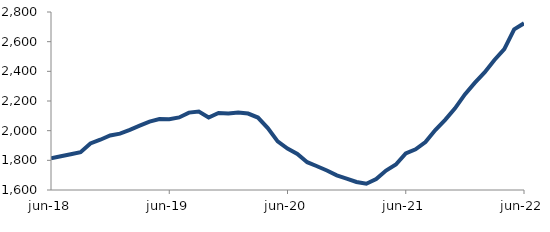
| Category | Series 0 |
|---|---|
| 2018-06-01 | 1813.666 |
| 2018-07-01 | 1827.546 |
| 2018-08-01 | 1840.869 |
| 2018-09-01 | 1854.761 |
| 2018-10-01 | 1913.466 |
| 2018-11-01 | 1938.846 |
| 2018-12-01 | 1967.481 |
| 2019-01-01 | 1980.122 |
| 2019-02-01 | 2005.664 |
| 2019-03-01 | 2033.637 |
| 2019-04-01 | 2060.76 |
| 2019-05-01 | 2078.07 |
| 2019-06-01 | 2076.377 |
| 2019-07-01 | 2089.152 |
| 2019-08-01 | 2121.901 |
| 2019-09-01 | 2128.491 |
| 2019-10-01 | 2088.553 |
| 2019-11-01 | 2119.211 |
| 2019-12-01 | 2116.27 |
| 2020-01-01 | 2123.179 |
| 2020-02-01 | 2115.217 |
| 2020-03-01 | 2088.6 |
| 2020-04-01 | 2017.241 |
| 2020-05-01 | 1928.116 |
| 2020-06-01 | 1878.979 |
| 2020-07-01 | 1843.29 |
| 2020-08-01 | 1787.543 |
| 2020-09-01 | 1760.281 |
| 2020-10-01 | 1731.197 |
| 2020-11-01 | 1698.835 |
| 2020-12-01 | 1677.184 |
| 2021-01-01 | 1654.072 |
| 2021-02-01 | 1641.869 |
| 2021-03-01 | 1673.821 |
| 2021-04-01 | 1730.759 |
| 2021-05-01 | 1771.425 |
| 2021-06-01 | 1846.573 |
| 2021-07-01 | 1874.111 |
| 2021-08-01 | 1922.894 |
| 2021-09-01 | 2004.225 |
| 2021-10-01 | 2073.331 |
| 2021-11-01 | 2150.314 |
| 2021-12-01 | 2244.492 |
| 2022-01-01 | 2321.95 |
| 2022-02-01 | 2392.65 |
| 2022-03-01 | 2476.383 |
| 2022-04-01 | 2549.069 |
| 2022-05-01 | 2683.336 |
| 2022-06-01 | 2723.868 |